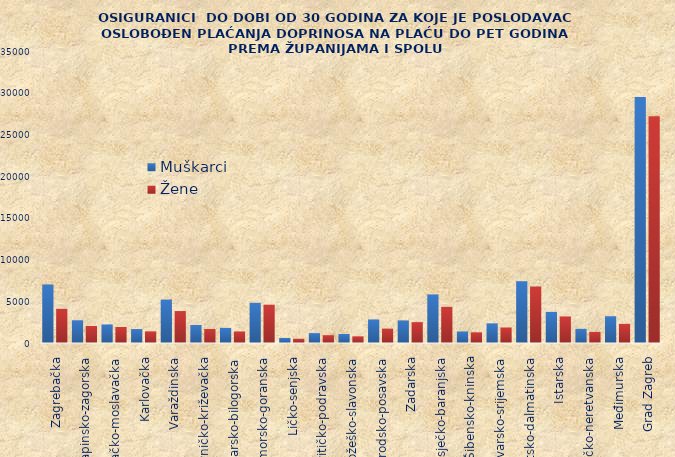
| Category | Muškarci | Žene |
|---|---|---|
| Zagrebačka | 7007 | 4097 |
| Krapinsko-zagorska | 2725 | 2035 |
| Sisačko-moslavačka | 2222 | 1920 |
| Karlovačka | 1672 | 1397 |
| Varaždinska | 5198 | 3831 |
| Koprivničko-križevačka | 2157 | 1680 |
| Bjelovarsko-bilogorska | 1810 | 1389 |
| Primorsko-goranska | 4814 | 4587 |
| Ličko-senjska | 607 | 506 |
| Virovitičko-podravska | 1184 | 936 |
| Požeško-slavonska | 1079 | 801 |
| Brodsko-posavska | 2825 | 1719 |
| Zadarska | 2695 | 2497 |
| Osječko-baranjska | 5827 | 4327 |
| Šibensko-kninska | 1386 | 1280 |
| Vukovarsko-srijemska | 2359 | 1862 |
| Splitsko-dalmatinska | 7406 | 6762 |
| Istarska | 3725 | 3185 |
| Dubrovačko-neretvanska | 1692 | 1328 |
| Međimurska | 3206 | 2293 |
| Grad Zagreb | 29476 | 27177 |